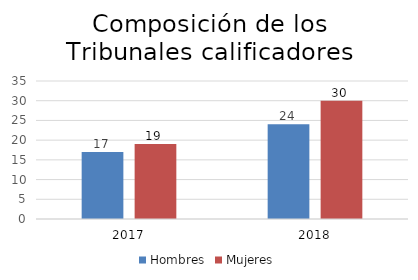
| Category | Hombres | Mujeres |
|---|---|---|
| 0 | 17 | 19 |
| 1 | 24 | 30 |